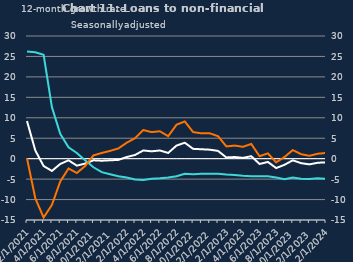
| Category | zero | Non-financial businesses | SMEs |
|---|---|---|---|
| Feb-2021 |  | 9.2 | 26.2 |
| Mar-2021 |  | 2 | 26 |
| Apr-2021 |  | -1.8 | 25.4 |
| May-2021 |  | -3 | 12.6 |
| Jun-2021 |  | -1.3 | 6.1 |
| Jul-2021 |  | -0.4 | 2.8 |
| Aug-2021 |  | -1.7 | 1.4 |
| Sep-2021 |  | -1.2 | -0.4 |
| Oct-2021 |  | -0.4 | -2.1 |
| Nov-2021 |  | -0.5 | -3.3 |
| Dec-2021 |  | -0.4 | -3.8 |
| Jan-2022 |  | -0.3 | -4.3 |
| Feb-2022 |  | 0.4 | -4.6 |
| Mar-2022 |  | 0.9 | -5.1 |
| Apr-2022 |  | 2 | -5.2 |
| May-2022 |  | 1.8 | -4.9 |
| Jun-2022 |  | 2 | -4.8 |
| Jul-2022 |  | 1.4 | -4.6 |
| Aug-2022 |  | 3.2 | -4.3 |
| Sep-2022 |  | 3.9 | -3.7 |
| Oct-2022 |  | 2.4 | -3.8 |
| Nov-2022 |  | 2.3 | -3.7 |
| Dec-2022 |  | 2.2 | -3.7 |
| Jan-2023 |  | 1.9 | -3.7 |
| Feb-2023 |  | 0.3 | -3.9 |
| Mar-2023 |  | 0.4 | -4 |
| Apr-2023 |  | 0.2 | -4.2 |
| May-2023 |  | 0.6 | -4.3 |
| Jun-2023 |  | -1.3 | -4.3 |
| Jul-2023 |  | -0.8 | -4.3 |
| Aug-2023 |  | -2.3 | -4.6 |
| Sep-2023 |  | -1.5 | -5 |
| Oct-2023 |  | -0.4 | -4.6 |
| Nov-2023 |  | -1.1 | -4.9 |
| Dec-2023 |  | -1.4 | -5 |
| Jan-2024 |  | -1 | -4.8 |
| Feb-2024 |  | -0.9 | -4.9 |